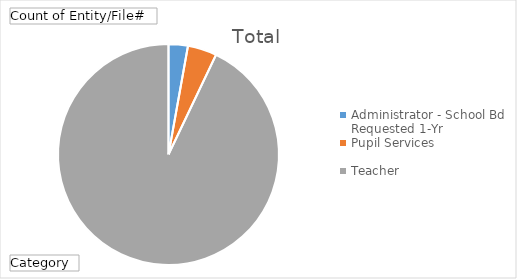
| Category | Total |
|---|---|
| Administrator - School Bd Requested 1-Yr | 85 |
| Pupil Services | 128 |
| Teacher | 2795 |